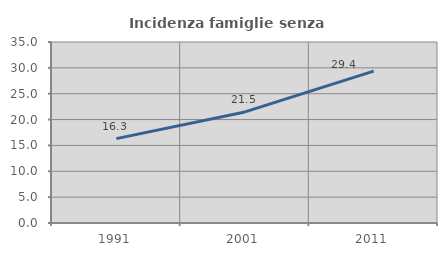
| Category | Incidenza famiglie senza nuclei |
|---|---|
| 1991.0 | 16.317 |
| 2001.0 | 21.476 |
| 2011.0 | 29.365 |